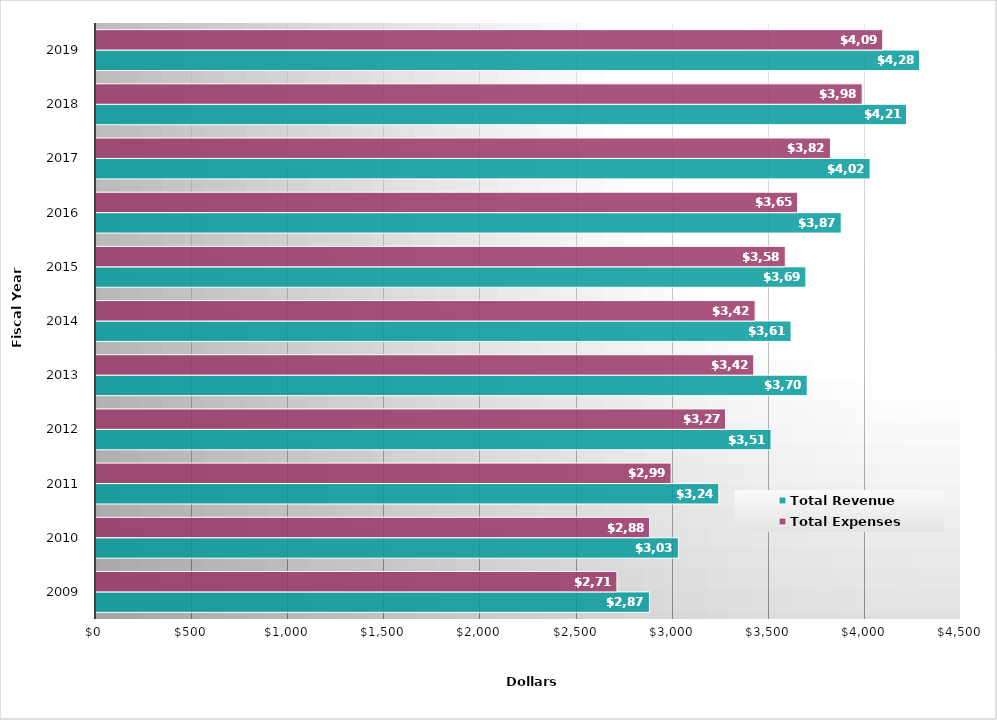
| Category | Total Revenue | Total Expenses |
|---|---|---|
| 2009.0 | 2879 | 2710 |
| 2010.0 | 3030 | 2880 |
| 2011.0 | 3240 | 2992 |
| 2012.0 | 3512 | 3275 |
| 2013.0 | 3700 | 3422 |
| 2014.0 | 3616 | 3429 |
| 2015.0 | 3693 | 3586 |
| 2016.0 | 3877 | 3650 |
| 2017.0 | 4027 | 3821 |
| 2018.0 | 4217 | 3986 |
| 2019.0 | 4285 | 4093 |